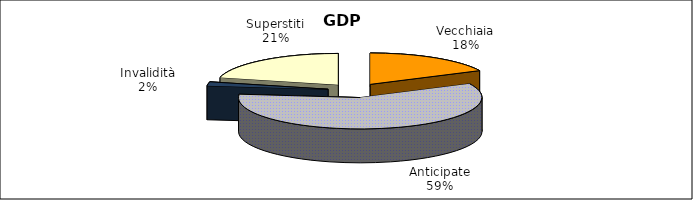
| Category | Series 0 |
|---|---|
| Vecchiaia | 26017 |
| Anticipate | 86256 |
| Invalidità | 3052 |
| Superstiti | 31018 |